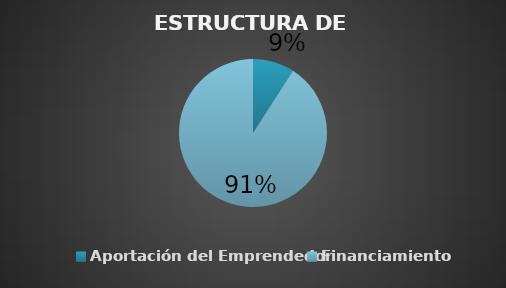
| Category | Series 0 |
|---|---|
| Aportación del Emprendedor | 0.091 |
| Financiamiento | 0.909 |